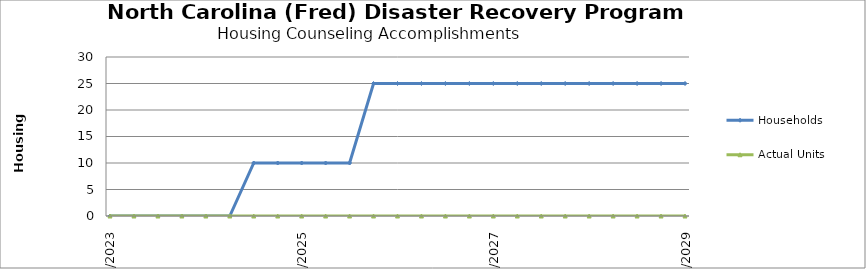
| Category | Households | Actual Units |
|---|---|---|
| 4/1/23 | 0 | 0 |
| 7/1/23 | 0 | 0 |
| 10/1/23 | 0 | 0 |
| 1/1/24 | 0 | 0 |
| 4/1/24 | 0 | 0 |
| 7/1/24 | 0 | 0 |
| 10/1/24 | 10 | 0 |
| 1/1/25 | 10 | 0 |
| 4/1/25 | 10 | 0 |
| 7/1/25 | 10 | 0 |
| 10/1/25 | 10 | 0 |
| 1/1/26 | 25 | 0 |
| 4/1/26 | 25 | 0 |
| 7/1/26 | 25 | 0 |
| 10/1/26 | 25 | 0 |
| 1/1/27 | 25 | 0 |
| 4/1/27 | 25 | 0 |
| 7/1/27 | 25 | 0 |
| 10/1/27 | 25 | 0 |
| 1/1/28 | 25 | 0 |
| 4/1/28 | 25 | 0 |
| 7/1/28 | 25 | 0 |
| 10/1/28 | 25 | 0 |
| 1/1/29 | 25 | 0 |
| 4/1/29 | 25 | 0 |